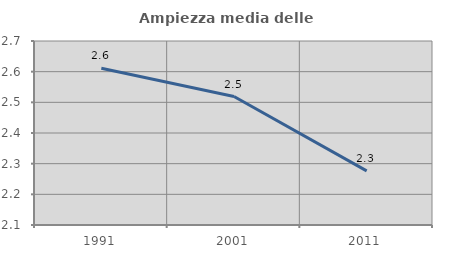
| Category | Ampiezza media delle famiglie |
|---|---|
| 1991.0 | 2.611 |
| 2001.0 | 2.519 |
| 2011.0 | 2.276 |